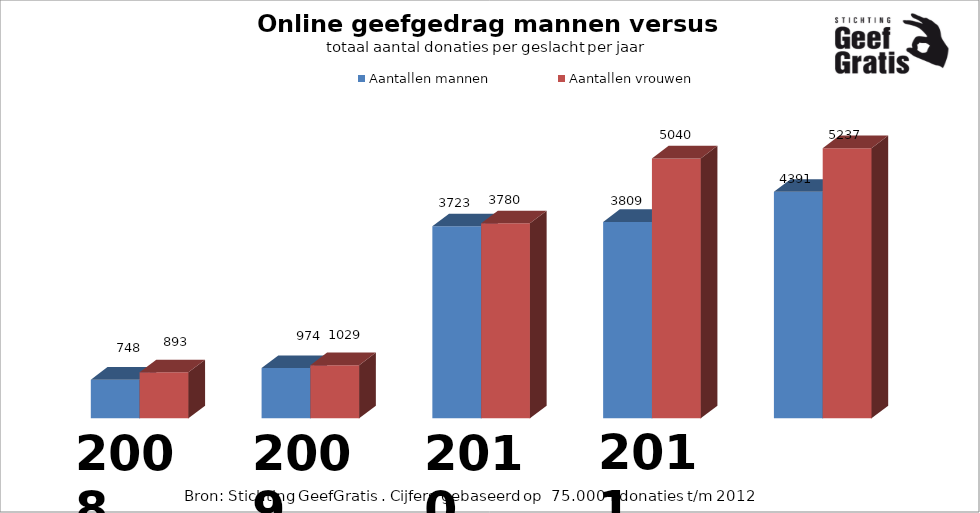
| Category | Aantallen mannen | Aantallen vrouwen |
|---|---|---|
| 0 | 748 | 893 |
| 1 | 974 | 1029 |
| 2 | 3723 | 3780 |
| 3 | 3809 | 5040 |
| 4 | 4391 | 5237 |